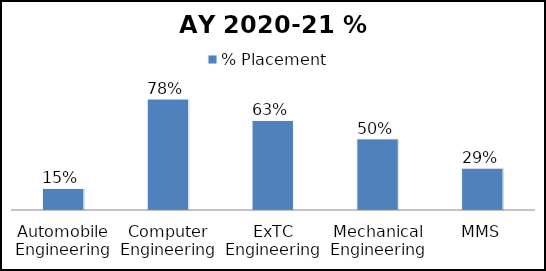
| Category | % Placement  |
|---|---|
| Automobile Engineering | 0.152 |
| Computer Engineering | 0.78 |
| ExTC Engineering | 0.63 |
| Mechanical Engineering | 0.5 |
| MMS | 0.294 |